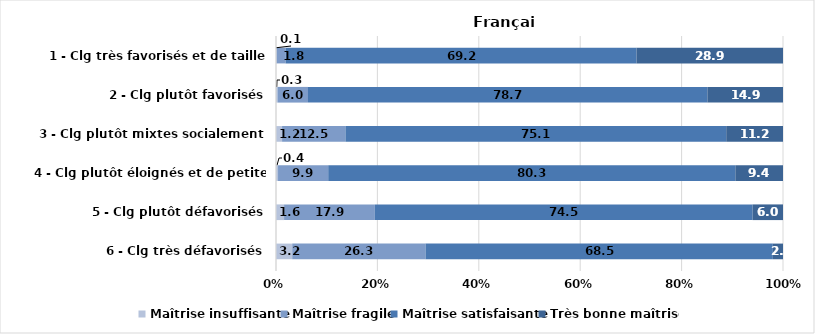
| Category | Maîtrise insuffisante | Maîtrise fragile | Maîtrise satisfaisante | Très bonne maîtrise |
|---|---|---|---|---|
| 6 - Clg très défavorisés | 3.2 | 26.3 | 68.5 | 2 |
| 5 - Clg plutôt défavorisés | 1.6 | 17.9 | 74.5 | 6 |
| 4 - Clg plutôt éloignés et de petite taille | 0.4 | 9.9 | 80.3 | 9.4 |
| 3 - Clg plutôt mixtes socialement | 1.2 | 12.5 | 75.1 | 11.2 |
| 2 - Clg plutôt favorisés | 0.3 | 6 | 78.7 | 14.9 |
| 1 - Clg très favorisés et de taille importante | 0.1 | 1.8 | 69.2 | 28.9 |